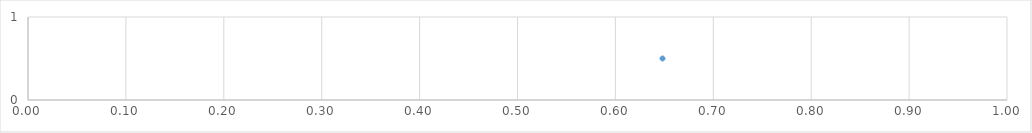
| Category | Series 0 |
|---|---|
| 0.6481260337504352 | 0.5 |